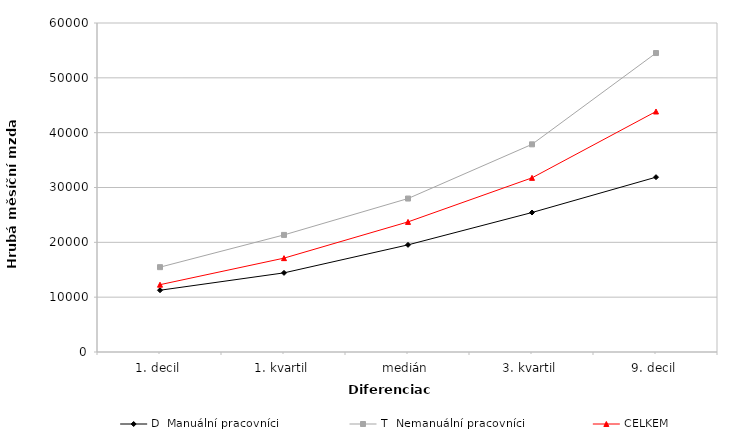
| Category | D  Manuální pracovníci | T  Nemanuální pracovníci | CELKEM |
|---|---|---|---|
| 1. decil | 11263.672 | 15472.218 | 12276.869 |
| 1. kvartil | 14430.333 | 21351.643 | 17118.226 |
| medián | 19537.221 | 27986.734 | 23726.277 |
| 3. kvartil | 25435.498 | 37871.054 | 31758.893 |
| 9. decil | 31883 | 54522.535 | 43861.555 |